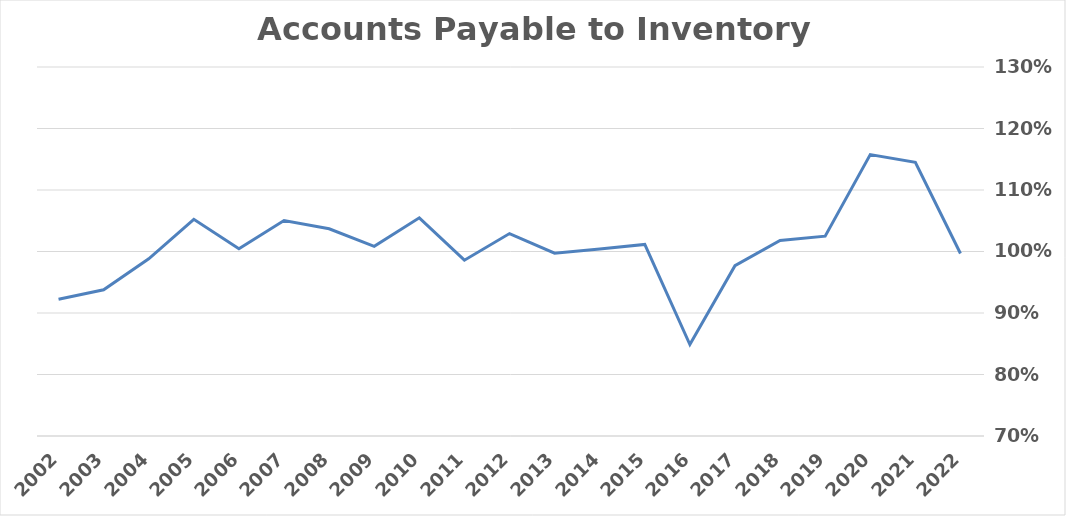
| Category | Payables to Inventory Ratio |
|---|---|
| 2022.0 | 0.997 |
| 2021.0 | 1.145 |
| 2020.0 | 1.158 |
| 2019.0 | 1.025 |
| 2018.0 | 1.018 |
| 2017.0 | 0.977 |
| 2016.0 | 0.849 |
| 2015.0 | 1.012 |
| 2014.0 | 1.004 |
| 2013.0 | 0.997 |
| 2012.0 | 1.029 |
| 2011.0 | 0.986 |
| 2010.0 | 1.055 |
| 2009.0 | 1.008 |
| 2008.0 | 1.037 |
| 2007.0 | 1.05 |
| 2006.0 | 1.004 |
| 2005.0 | 1.052 |
| 2004.0 | 0.988 |
| 2003.0 | 0.938 |
| 2002.0 | 0.922 |